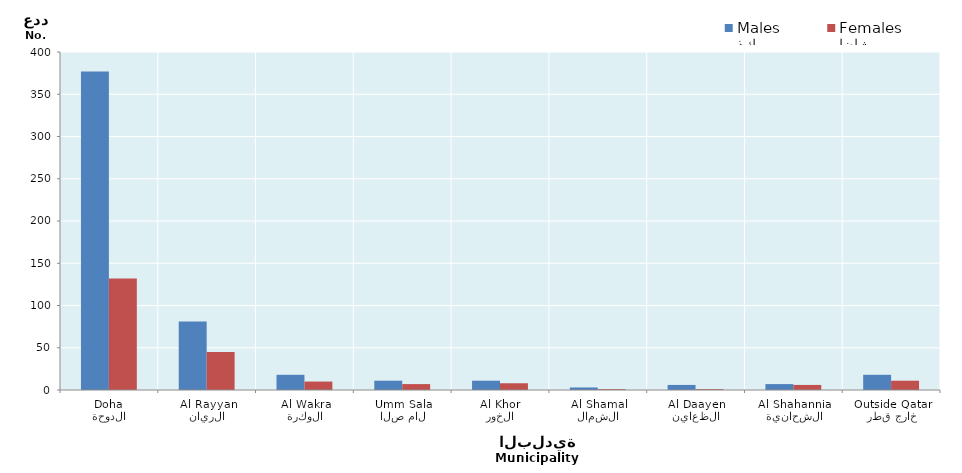
| Category | ذكور
Males | إناث
Females |
|---|---|---|
| الدوحة
Doha | 377 | 132 |
| الريان
Al Rayyan | 81 | 45 |
| الوكرة
Al Wakra | 18 | 10 |
| ام صلال
Umm Salal | 11 | 7 |
| الخور
Al Khor | 11 | 8 |
| الشمال
Al Shamal | 3 | 1 |
| الظعاين
Al Daayen | 6 | 1 |
| الشحانية
Al Shahannia | 7 | 6 |
| خارج قطر
Outside Qatar | 18 | 11 |